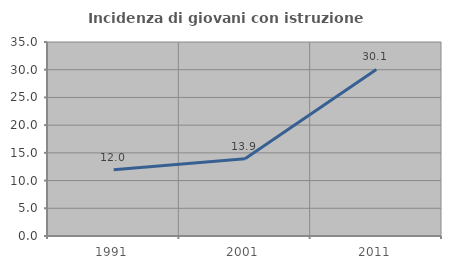
| Category | Incidenza di giovani con istruzione universitaria |
|---|---|
| 1991.0 | 11.958 |
| 2001.0 | 13.931 |
| 2011.0 | 30.054 |